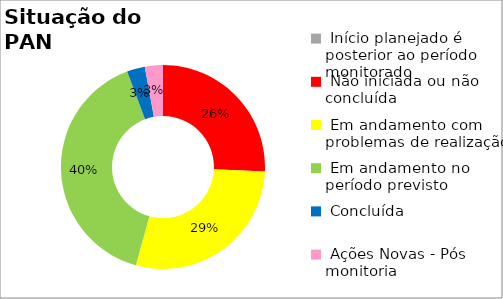
| Category | Series 0 |
|---|---|
|  Início planejado é posterior ao período monitorado | 0 |
|  Não iniciada ou não concluída | 0.257 |
|  Em andamento com problemas de realização | 0.286 |
|  Em andamento no período previsto  | 0.4 |
|  Concluída | 0.029 |
|  Ações Novas - Pós monitoria | 0.029 |